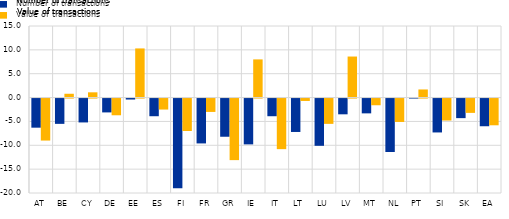
| Category | Number of transactions | Value of transactions |
|---|---|---|
| AT | -6.1 | -8.8 |
| BE | -5.3 | 0.8 |
| CY | -5 | 1.1 |
| DE | -2.9 | -3.5 |
| EE | -0.2 | 10.3 |
| ES | -3.7 | -2.3 |
| FI | -18.8 | -6.8 |
| FR | -9.4 | -2.8 |
| GR | -8 | -12.9 |
| IE | -9.6 | 8 |
| IT | -3.7 | -10.6 |
| LT | -7 | -0.5 |
| LU | -9.9 | -5.3 |
| LV | -3.3 | 8.6 |
| MT | -3.1 | -1.4 |
| NL | -11.2 | -4.9 |
| PT | 0.1 | 1.7 |
| SI | -7.1 | -4.6 |
| SK | -4.1 | -3 |
| EA | -5.8 | -5.6 |